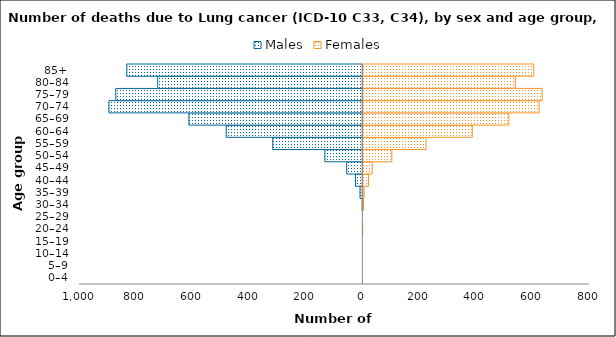
| Category | Males | Females |
|---|---|---|
| 0–4 | 0 | 0 |
| 5–9 | 0 | 0 |
| 10–14 | 0 | 0 |
| 15–19 | 0 | 0 |
| 20–24 | 0 | 1 |
| 25–29 | 0 | 0 |
| 30–34 | -2 | 4 |
| 35–39 | -10 | 6 |
| 40–44 | -26 | 22 |
| 45–49 | -57 | 35 |
| 50–54 | -134 | 104 |
| 55–59 | -318 | 225 |
| 60–64 | -482 | 388 |
| 65–69 | -614 | 517 |
| 70–74 | -896 | 624 |
| 75–79 | -872 | 635 |
| 80–84 | -724 | 540 |
| 85+ | -833 | 605 |